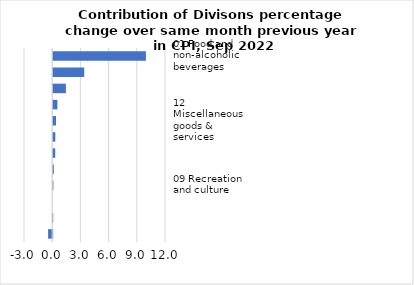
| Category |     Contributions |
|---|---|
| 01 Food and non-alcoholic beverages | 9.861 |
| 07 Transport | 3.299 |
| 08 Communication | 1.35 |
| 11 Restaurants and hotels | 0.445 |
| 12 Miscellaneous goods & services | 0.3 |
| 05 Furnishings, household equipment & maintenance | 0.224 |
| 02 Alcoholic beverages, tobacco & narcotics | 0.213 |
| 03 Clothing and footwear | 0.064 |
| 09 Recreation and culture | 0.02 |
| 10 Education | 0 |
| 06 Health | -0.021 |
| 04 Housing, water, electricity, gas & other fuels | -0.436 |